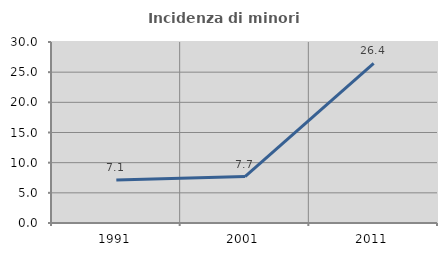
| Category | Incidenza di minori stranieri |
|---|---|
| 1991.0 | 7.143 |
| 2001.0 | 7.692 |
| 2011.0 | 26.449 |